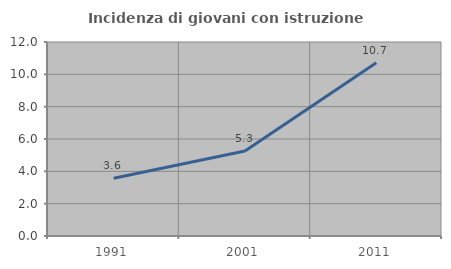
| Category | Incidenza di giovani con istruzione universitaria |
|---|---|
| 1991.0 | 3.571 |
| 2001.0 | 5.263 |
| 2011.0 | 10.714 |